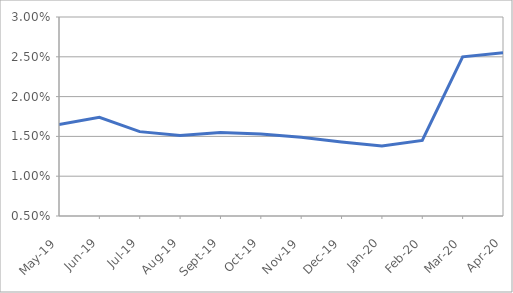
| Category | Series 0 |
|---|---|
| 2019-05-01 | 0.016 |
| 2019-06-01 | 0.017 |
| 2019-07-01 | 0.016 |
| 2019-08-01 | 0.015 |
| 2019-09-01 | 0.015 |
| 2019-10-01 | 0.015 |
| 2019-11-01 | 0.015 |
| 2019-12-01 | 0.014 |
| 2020-01-01 | 0.014 |
| 2020-02-01 | 0.014 |
| 2020-03-01 | 0.025 |
| 2020-04-01 | 0.026 |